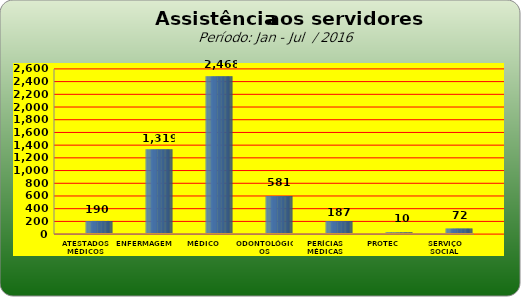
| Category | Series 0 |
|---|---|
| ATESTADOS MÉDICOS | 190 |
| ENFERMAGEM | 1319 |
| MÉDICO | 2468 |
| ODONTOLÓGICOS | 581 |
| PERÍCIAS MÉDICAS | 187 |
| PROTEC | 10 |
| SERVIÇO SOCIAL | 72 |